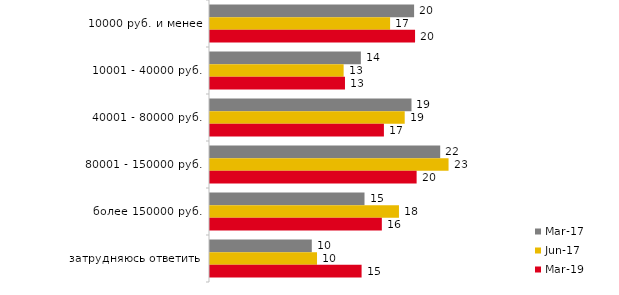
| Category | мар.17 | июн.17 | мар.19 |
|---|---|---|---|
| 10000 руб. и менее | 19.55 | 17.25 | 19.642 |
| 10001 - 40000 руб. | 14.45 | 12.8 | 12.929 |
| 40001 - 80000 руб. | 19.3 | 18.65 | 16.658 |
| 80001 - 150000 руб. | 22.05 | 22.85 | 19.791 |
| более 150000 руб. | 14.8 | 18.1 | 16.459 |
| затрудняюсь ответить | 9.75 | 10.25 | 14.52 |